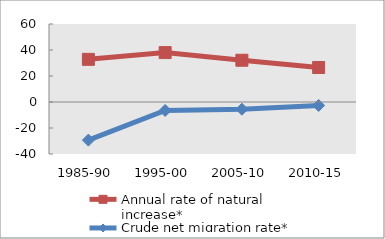
| Category | Annual rate of natural increase* | Crude net migration rate* |
|---|---|---|
| 1985-90 | 32.801 | -29.324 |
| 1995-00 | 38.007 | -6.481 |
| 2005-10 | 32.117 | -5.553 |
| 2010-15 | 26.547 | -2.649 |